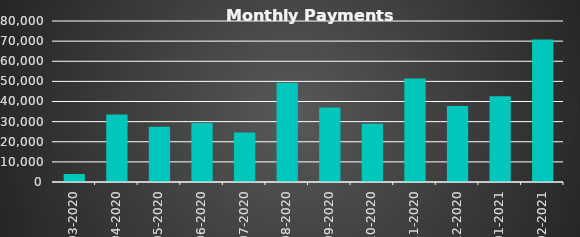
| Category |  Payments  |
|---|---|
| 2020-03-31 | 3984 |
| 2020-04-30 | 33555.6 |
| 2020-05-31 | 27479.4 |
| 2020-06-30 | 29260.4 |
| 2020-07-31 | 24586.08 |
| 2020-08-31 | 49333.2 |
| 2020-09-30 | 36987 |
| 2020-10-31 | 28984.2 |
| 2020-11-30 | 51385.2 |
| 2020-12-31 | 37716.6 |
| 2021-01-31 | 42547.04 |
| 2021-02-28 | 70825.92 |